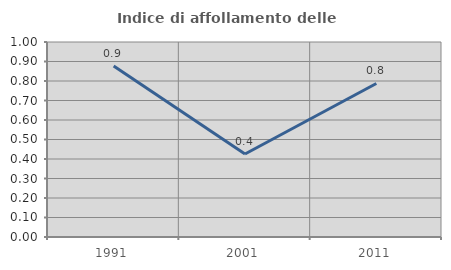
| Category | Indice di affollamento delle abitazioni  |
|---|---|
| 1991.0 | 0.877 |
| 2001.0 | 0.426 |
| 2011.0 | 0.787 |